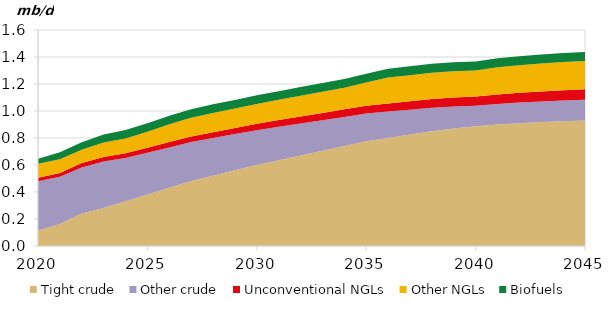
| Category | Tight crude | Other crude | Unconventional NGLs | Other NGLs | Biofuels |
|---|---|---|---|---|---|
| 2020-01-01 | 0.115 | 0.365 | 0.025 | 0.103 | 0.037 |
| 2021-01-01 | 0.163 | 0.35 | 0.027 | 0.103 | 0.051 |
| 2022-01-01 | 0.241 | 0.341 | 0.032 | 0.098 | 0.056 |
| 2023-01-01 | 0.281 | 0.345 | 0.034 | 0.106 | 0.06 |
| 2024-01-01 | 0.331 | 0.32 | 0.036 | 0.11 | 0.063 |
| 2025-01-01 | 0.381 | 0.31 | 0.038 | 0.119 | 0.063 |
| 2026-01-01 | 0.431 | 0.299 | 0.04 | 0.132 | 0.063 |
| 2027-01-01 | 0.481 | 0.289 | 0.042 | 0.138 | 0.063 |
| 2028-01-01 | 0.521 | 0.278 | 0.044 | 0.143 | 0.063 |
| 2029-01-01 | 0.561 | 0.268 | 0.046 | 0.144 | 0.064 |
| 2030-01-01 | 0.601 | 0.257 | 0.048 | 0.146 | 0.064 |
| 2031-01-01 | 0.636 | 0.247 | 0.05 | 0.15 | 0.064 |
| 2032-01-01 | 0.671 | 0.237 | 0.052 | 0.154 | 0.064 |
| 2033-01-01 | 0.706 | 0.226 | 0.054 | 0.156 | 0.065 |
| 2034-01-01 | 0.741 | 0.216 | 0.056 | 0.16 | 0.065 |
| 2035-01-01 | 0.776 | 0.205 | 0.058 | 0.173 | 0.065 |
| 2036-01-01 | 0.801 | 0.195 | 0.06 | 0.193 | 0.065 |
| 2037-01-01 | 0.826 | 0.184 | 0.062 | 0.193 | 0.065 |
| 2038-01-01 | 0.851 | 0.174 | 0.064 | 0.196 | 0.066 |
| 2039-01-01 | 0.871 | 0.163 | 0.066 | 0.195 | 0.066 |
| 2040-01-01 | 0.887 | 0.153 | 0.068 | 0.193 | 0.066 |
| 2041-01-01 | 0.9 | 0.153 | 0.07 | 0.202 | 0.066 |
| 2042-01-01 | 0.91 | 0.153 | 0.072 | 0.205 | 0.066 |
| 2043-01-01 | 0.918 | 0.153 | 0.074 | 0.207 | 0.067 |
| 2044-01-01 | 0.925 | 0.153 | 0.076 | 0.21 | 0.067 |
| 2045-01-01 | 0.93 | 0.153 | 0.078 | 0.21 | 0.067 |